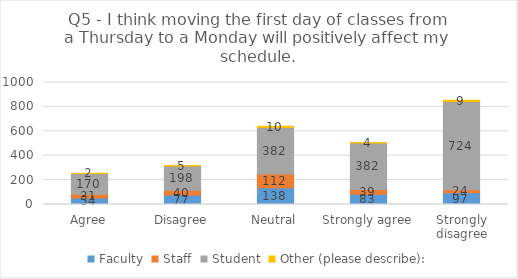
| Category | Faculty | Staff | Student | Other (please describe): |
|---|---|---|---|---|
| Agree | 54 | 31 | 170 | 2 |
| Disagree | 77 | 40 | 198 | 5 |
| Neutral | 138 | 112 | 382 | 10 |
| Strongly agree | 83 | 39 | 382 | 4 |
| Strongly disagree | 97 | 24 | 724 | 9 |